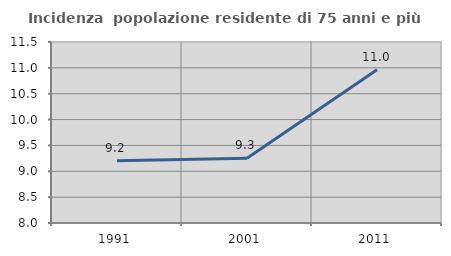
| Category | Incidenza  popolazione residente di 75 anni e più |
|---|---|
| 1991.0 | 9.202 |
| 2001.0 | 9.252 |
| 2011.0 | 10.964 |